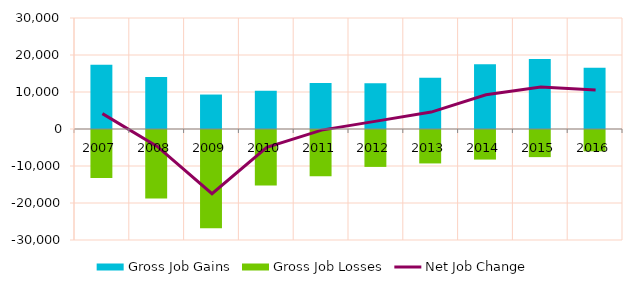
| Category | Gross Job Gains | Gross Job Losses |
|---|---|---|
| 2007.0 | 17381 | -13222 |
| 2008.0 | 14078 | -18801 |
| 2009.0 | 9313 | -26797 |
| 2010.0 | 10336 | -15274 |
| 2011.0 | 12456 | -12753 |
| 2012.0 | 12370 | -10244 |
| 2013.0 | 13883 | -9304 |
| 2014.0 | 17510 | -8261 |
| 2015.0 | 18942 | -7600 |
| 2016.0 | 16552 | -6041 |